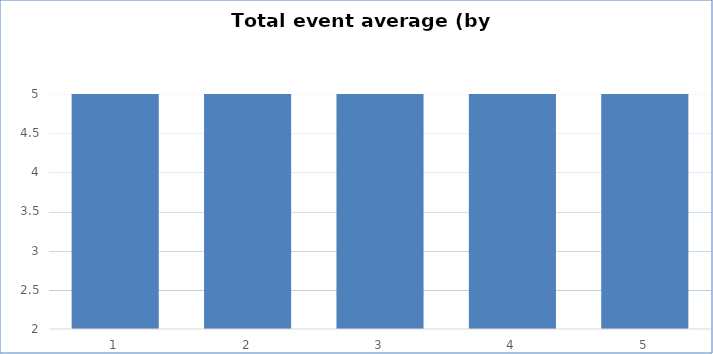
| Category | Series 0 |
|---|---|
| 0 | 5 |
| 1 | 5 |
| 2 | 5 |
| 3 | 5 |
| 4 | 5 |